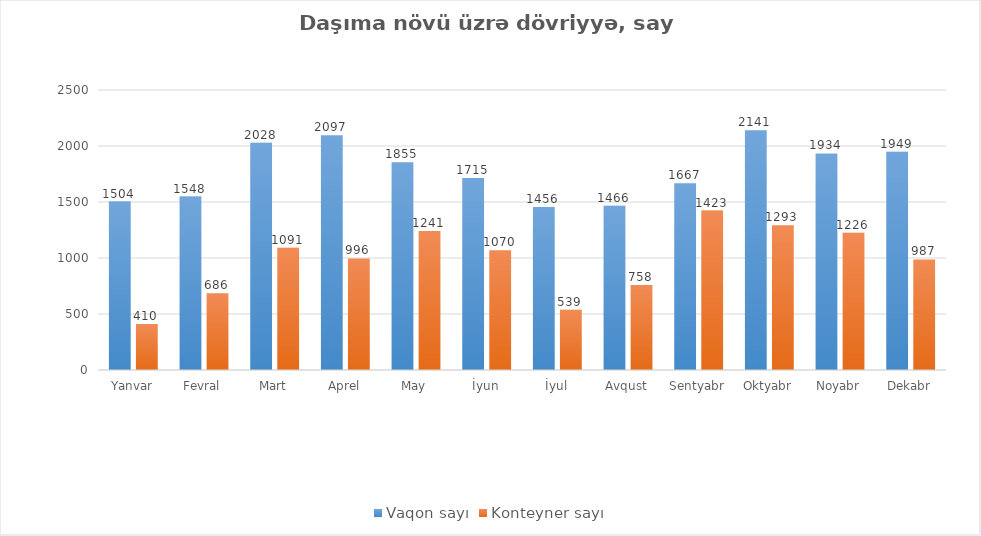
| Category | Vaqon sayı | Konteyner sayı |
|---|---|---|
| Yanvar | 1504 | 410 |
| Fevral | 1548 | 686 |
| Mart | 2028 | 1091 |
| Aprel | 2097 | 996 |
| May | 1855 | 1241 |
| İyun | 1715 | 1070 |
| İyul | 1456 | 539 |
| Avqust | 1466 | 758 |
| Sentyabr | 1667 | 1423 |
| Oktyabr | 2141 | 1293 |
| Noyabr | 1934 | 1226 |
| Dekabr | 1949 | 987 |